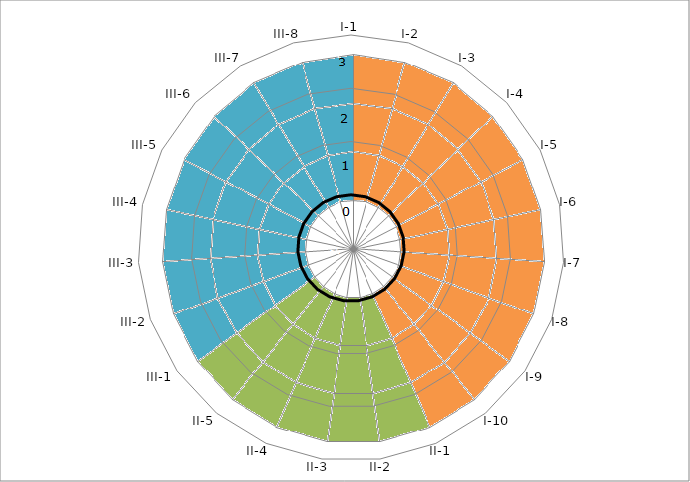
| Category | Series 0 |
|---|---|
| I-1 | 0 |
| I-2 | 0 |
| I-3 | 0 |
| I-4 | 0 |
| I-5 | 0 |
| I-6 | 0 |
| I-7 | 0 |
| I-8 | 0 |
| I-9 | 0 |
| I-10 | 0 |
| II-1 | 0 |
| II-2 | 0 |
| II-3 | 0 |
| II-4 | 0 |
| II-5 | 0 |
| III-1 | 0 |
| III-2 | 0 |
| III-3 | 0 |
| III-4 | 0 |
| III-5 | 0 |
| III-6 | 0 |
| III-7 | 0 |
| III-8 | 0 |